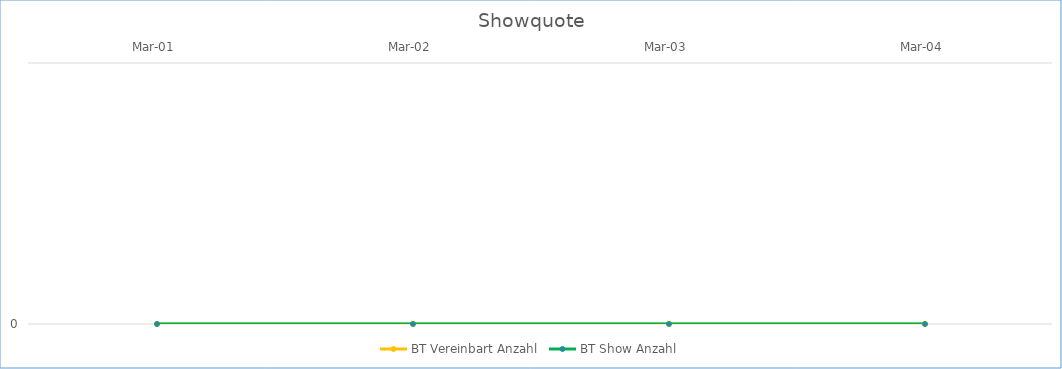
| Category | BT Vereinbart Anzahl | BT Show Anzahl |
|---|---|---|
| 2001-03-01 | 0 | 0 |
| 2002-03-01 | 0 | 0 |
| 2003-03-01 | 0 | 0 |
| 2004-03-01 | 0 | 0 |